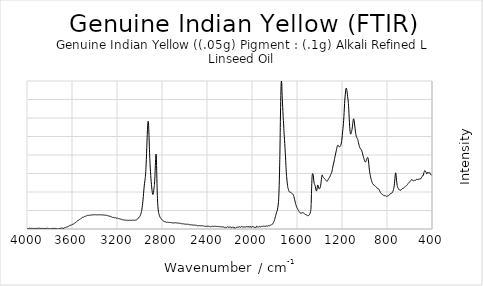
| Category | Series 0 |
|---|---|
| 3996.70739 | 0.005 |
| 3994.64617 | 0.006 |
| 3992.58495 | 0.008 |
| 3990.52373 | 0.007 |
| 3988.46251 | 0.006 |
| 3986.40129 | 0.007 |
| 3984.34007 | 0.009 |
| 3982.27885 | 0.01 |
| 3980.21763 | 0.01 |
| 3978.15641 | 0.01 |
| 3976.09519 | 0.01 |
| 3974.03396 | 0.008 |
| 3971.97274 | 0.006 |
| 3969.91152 | 0.006 |
| 3967.8503 | 0.009 |
| 3965.78908 | 0.01 |
| 3963.72786 | 0.009 |
| 3961.66664 | 0.008 |
| 3959.60542 | 0.009 |
| 3957.5442 | 0.008 |
| 3955.48298 | 0.006 |
| 3953.42175 | 0.006 |
| 3951.36053 | 0.008 |
| 3949.29931 | 0.008 |
| 3947.23809 | 0.008 |
| 3945.17687 | 0.009 |
| 3943.11565 | 0.009 |
| 3941.05443 | 0.008 |
| 3938.99321 | 0.007 |
| 3936.93199 | 0.007 |
| 3934.87077 | 0.005 |
| 3932.80955 | 0.005 |
| 3930.74832 | 0.006 |
| 3928.6871 | 0.008 |
| 3926.62588 | 0.009 |
| 3924.56466 | 0.009 |
| 3922.50344 | 0.008 |
| 3920.44222 | 0.007 |
| 3918.381 | 0.006 |
| 3916.31978 | 0.006 |
| 3914.25856 | 0.006 |
| 3912.19734 | 0.005 |
| 3910.13612 | 0.006 |
| 3908.07489 | 0.007 |
| 3906.01367 | 0.008 |
| 3903.95245 | 0.007 |
| 3901.89123 | 0.008 |
| 3899.83001 | 0.01 |
| 3897.76879 | 0.011 |
| 3895.70757 | 0.011 |
| 3893.64635 | 0.011 |
| 3891.58513 | 0.011 |
| 3889.52391 | 0.01 |
| 3887.46268 | 0.008 |
| 3885.40146 | 0.006 |
| 3883.34024 | 0.005 |
| 3881.27902 | 0.006 |
| 3879.2178 | 0.008 |
| 3877.15658 | 0.01 |
| 3875.09536 | 0.011 |
| 3873.03414 | 0.009 |
| 3870.97292 | 0.008 |
| 3868.9117 | 0.009 |
| 3866.85048 | 0.009 |
| 3864.78925 | 0.006 |
| 3862.72803 | 0.003 |
| 3860.66681 | 0.005 |
| 3858.60559 | 0.007 |
| 3856.54437 | 0.008 |
| 3854.48315 | 0.009 |
| 3852.42193 | 0.009 |
| 3850.36071 | 0.009 |
| 3848.29949 | 0.008 |
| 3846.23827 | 0.007 |
| 3844.17705 | 0.006 |
| 3842.11582 | 0.005 |
| 3840.0546 | 0.006 |
| 3837.99338 | 0.007 |
| 3835.93216 | 0.007 |
| 3833.87094 | 0.008 |
| 3831.80972 | 0.009 |
| 3829.7485 | 0.01 |
| 3827.68728 | 0.01 |
| 3825.62606 | 0.009 |
| 3823.56484 | 0.008 |
| 3821.50361 | 0.008 |
| 3819.44239 | 0.009 |
| 3817.38117 | 0.011 |
| 3815.31995 | 0.01 |
| 3813.25873 | 0.006 |
| 3811.19751 | 0.004 |
| 3809.13629 | 0.004 |
| 3807.07507 | 0.005 |
| 3805.01385 | 0.005 |
| 3802.95263 | 0.003 |
| 3800.89141 | 0.002 |
| 3798.83018 | 0.005 |
| 3796.76896 | 0.008 |
| 3794.70774 | 0.008 |
| 3792.64652 | 0.006 |
| 3790.5853 | 0.003 |
| 3788.52408 | 0.001 |
| 3786.46286 | 0.002 |
| 3784.40164 | 0.003 |
| 3782.34042 | 0.004 |
| 3780.2792 | 0.005 |
| 3778.21798 | 0.007 |
| 3776.15675 | 0.008 |
| 3774.09553 | 0.008 |
| 3772.03431 | 0.008 |
| 3769.97309 | 0.007 |
| 3767.91187 | 0.007 |
| 3765.85065 | 0.007 |
| 3763.78943 | 0.006 |
| 3761.72821 | 0.005 |
| 3759.66699 | 0.004 |
| 3757.60577 | 0.004 |
| 3755.54454 | 0.007 |
| 3753.48332 | 0.01 |
| 3751.4221 | 0.01 |
| 3749.36088 | 0.009 |
| 3747.29966 | 0.008 |
| 3745.23844 | 0.009 |
| 3743.17722 | 0.009 |
| 3741.116 | 0.007 |
| 3739.05478 | 0.005 |
| 3736.99356 | 0.003 |
| 3734.93234 | 0.003 |
| 3732.87111 | 0.002 |
| 3730.80989 | 0.001 |
| 3728.74867 | 0.002 |
| 3726.68745 | 0.002 |
| 3724.62623 | 0.001 |
| 3722.56501 | 0.001 |
| 3720.50379 | 0.001 |
| 3718.44257 | 0.002 |
| 3716.38135 | 0.002 |
| 3714.32013 | 0.004 |
| 3712.25891 | 0.005 |
| 3710.19768 | 0.005 |
| 3708.13646 | 0.007 |
| 3706.07524 | 0.01 |
| 3704.01402 | 0.011 |
| 3701.9528 | 0.01 |
| 3699.89158 | 0.008 |
| 3697.83036 | 0.007 |
| 3695.76914 | 0.009 |
| 3693.70792 | 0.012 |
| 3691.6467 | 0.015 |
| 3689.58548 | 0.015 |
| 3687.52425 | 0.011 |
| 3685.46303 | 0.01 |
| 3683.40181 | 0.011 |
| 3681.34059 | 0.013 |
| 3679.27937 | 0.014 |
| 3677.21815 | 0.012 |
| 3675.15693 | 0.009 |
| 3673.09571 | 0.008 |
| 3671.03449 | 0.01 |
| 3668.97327 | 0.015 |
| 3666.91204 | 0.018 |
| 3664.85082 | 0.019 |
| 3662.7896 | 0.019 |
| 3660.72838 | 0.02 |
| 3658.66716 | 0.02 |
| 3656.60594 | 0.022 |
| 3654.54472 | 0.026 |
| 3652.4835 | 0.028 |
| 3650.42228 | 0.026 |
| 3648.36106 | 0.025 |
| 3646.29984 | 0.028 |
| 3644.23861 | 0.03 |
| 3642.17739 | 0.031 |
| 3640.11617 | 0.031 |
| 3638.05495 | 0.031 |
| 3635.99373 | 0.033 |
| 3633.93251 | 0.036 |
| 3631.87129 | 0.037 |
| 3629.81007 | 0.036 |
| 3627.74885 | 0.037 |
| 3625.68763 | 0.039 |
| 3623.62641 | 0.043 |
| 3621.56518 | 0.047 |
| 3619.50396 | 0.05 |
| 3617.44274 | 0.05 |
| 3615.38152 | 0.05 |
| 3613.3203 | 0.05 |
| 3611.25908 | 0.05 |
| 3609.19786 | 0.049 |
| 3607.13664 | 0.05 |
| 3605.07542 | 0.053 |
| 3603.0142 | 0.055 |
| 3600.95297 | 0.059 |
| 3598.89175 | 0.062 |
| 3596.83053 | 0.064 |
| 3594.76931 | 0.063 |
| 3592.70809 | 0.062 |
| 3590.64687 | 0.064 |
| 3588.58565 | 0.065 |
| 3586.52443 | 0.066 |
| 3584.46321 | 0.07 |
| 3582.40199 | 0.073 |
| 3580.34077 | 0.075 |
| 3578.27954 | 0.077 |
| 3576.21832 | 0.079 |
| 3574.1571 | 0.081 |
| 3572.09588 | 0.084 |
| 3570.03466 | 0.088 |
| 3567.97344 | 0.088 |
| 3565.91222 | 0.09 |
| 3563.851 | 0.092 |
| 3561.78978 | 0.096 |
| 3559.72856 | 0.098 |
| 3557.66734 | 0.1 |
| 3555.60611 | 0.102 |
| 3553.54489 | 0.105 |
| 3551.48367 | 0.107 |
| 3549.42245 | 0.112 |
| 3547.36123 | 0.116 |
| 3545.30001 | 0.118 |
| 3543.23879 | 0.119 |
| 3541.17757 | 0.121 |
| 3539.11635 | 0.122 |
| 3537.05513 | 0.125 |
| 3534.9939 | 0.126 |
| 3532.93268 | 0.128 |
| 3530.87146 | 0.131 |
| 3528.81024 | 0.134 |
| 3526.74902 | 0.135 |
| 3524.6878 | 0.136 |
| 3522.62658 | 0.139 |
| 3520.56536 | 0.142 |
| 3518.50414 | 0.144 |
| 3516.44292 | 0.145 |
| 3514.3817 | 0.147 |
| 3512.32047 | 0.15 |
| 3510.25925 | 0.153 |
| 3508.19803 | 0.156 |
| 3506.13681 | 0.157 |
| 3504.07559 | 0.157 |
| 3502.01437 | 0.156 |
| 3499.95315 | 0.157 |
| 3497.89193 | 0.16 |
| 3495.83071 | 0.163 |
| 3493.76949 | 0.165 |
| 3491.70827 | 0.166 |
| 3489.64704 | 0.167 |
| 3487.58582 | 0.168 |
| 3485.5246 | 0.168 |
| 3483.46338 | 0.169 |
| 3481.40216 | 0.17 |
| 3479.34094 | 0.173 |
| 3477.27972 | 0.174 |
| 3475.2185 | 0.175 |
| 3473.15728 | 0.176 |
| 3471.09606 | 0.178 |
| 3469.03483 | 0.181 |
| 3466.97361 | 0.182 |
| 3464.91239 | 0.183 |
| 3462.85117 | 0.184 |
| 3460.78995 | 0.185 |
| 3458.72873 | 0.184 |
| 3456.66751 | 0.184 |
| 3454.60629 | 0.184 |
| 3452.54507 | 0.183 |
| 3450.48385 | 0.183 |
| 3448.42263 | 0.183 |
| 3446.3614 | 0.184 |
| 3444.30018 | 0.186 |
| 3442.23896 | 0.188 |
| 3440.17774 | 0.188 |
| 3438.11652 | 0.188 |
| 3436.0553 | 0.188 |
| 3433.99408 | 0.187 |
| 3431.93286 | 0.186 |
| 3429.87164 | 0.187 |
| 3427.81042 | 0.189 |
| 3425.7492 | 0.189 |
| 3423.68797 | 0.19 |
| 3421.62675 | 0.191 |
| 3419.56553 | 0.191 |
| 3417.50431 | 0.191 |
| 3415.44309 | 0.191 |
| 3413.38187 | 0.192 |
| 3411.32065 | 0.192 |
| 3409.25943 | 0.191 |
| 3407.19821 | 0.19 |
| 3405.13699 | 0.192 |
| 3403.07576 | 0.195 |
| 3401.01454 | 0.195 |
| 3398.95332 | 0.194 |
| 3396.8921 | 0.193 |
| 3394.83088 | 0.193 |
| 3392.76966 | 0.193 |
| 3390.70844 | 0.192 |
| 3388.64722 | 0.193 |
| 3386.586 | 0.194 |
| 3384.52478 | 0.192 |
| 3382.46356 | 0.191 |
| 3380.40233 | 0.192 |
| 3378.34111 | 0.192 |
| 3376.27989 | 0.192 |
| 3374.21867 | 0.192 |
| 3372.15745 | 0.191 |
| 3370.09623 | 0.192 |
| 3368.03501 | 0.192 |
| 3365.97379 | 0.191 |
| 3363.91257 | 0.192 |
| 3361.85135 | 0.193 |
| 3359.79013 | 0.191 |
| 3357.7289 | 0.191 |
| 3355.66768 | 0.193 |
| 3353.60646 | 0.193 |
| 3351.54524 | 0.192 |
| 3349.48402 | 0.191 |
| 3347.4228 | 0.192 |
| 3345.36158 | 0.191 |
| 3343.30036 | 0.19 |
| 3341.23914 | 0.189 |
| 3339.17792 | 0.19 |
| 3337.11669 | 0.192 |
| 3335.05547 | 0.191 |
| 3332.99425 | 0.19 |
| 3330.93303 | 0.19 |
| 3328.87181 | 0.19 |
| 3326.81059 | 0.19 |
| 3324.74937 | 0.19 |
| 3322.68815 | 0.191 |
| 3320.62693 | 0.191 |
| 3318.56571 | 0.189 |
| 3316.50449 | 0.188 |
| 3314.44326 | 0.189 |
| 3312.38204 | 0.189 |
| 3310.32082 | 0.187 |
| 3308.2596 | 0.186 |
| 3306.19838 | 0.185 |
| 3304.13716 | 0.185 |
| 3302.07594 | 0.184 |
| 3300.01472 | 0.185 |
| 3297.9535 | 0.185 |
| 3295.89228 | 0.186 |
| 3293.83106 | 0.186 |
| 3291.76983 | 0.185 |
| 3289.70861 | 0.183 |
| 3287.64739 | 0.182 |
| 3285.58617 | 0.182 |
| 3283.52495 | 0.18 |
| 3281.46373 | 0.178 |
| 3279.40251 | 0.177 |
| 3277.34129 | 0.177 |
| 3275.28007 | 0.176 |
| 3273.21885 | 0.177 |
| 3271.15763 | 0.178 |
| 3269.0964 | 0.177 |
| 3267.03518 | 0.173 |
| 3264.97396 | 0.171 |
| 3262.91274 | 0.171 |
| 3260.85152 | 0.17 |
| 3258.7903 | 0.169 |
| 3256.72908 | 0.17 |
| 3254.66786 | 0.17 |
| 3252.60664 | 0.168 |
| 3250.54542 | 0.166 |
| 3248.48419 | 0.164 |
| 3246.42297 | 0.162 |
| 3244.36175 | 0.16 |
| 3242.30053 | 0.157 |
| 3240.23931 | 0.156 |
| 3238.17809 | 0.157 |
| 3236.11687 | 0.159 |
| 3234.05565 | 0.16 |
| 3231.99443 | 0.158 |
| 3229.93321 | 0.157 |
| 3227.87199 | 0.158 |
| 3225.81076 | 0.157 |
| 3223.74954 | 0.154 |
| 3221.68832 | 0.153 |
| 3219.6271 | 0.154 |
| 3217.56588 | 0.154 |
| 3215.50466 | 0.154 |
| 3213.44344 | 0.152 |
| 3211.38222 | 0.15 |
| 3209.321 | 0.15 |
| 3207.25978 | 0.149 |
| 3205.19856 | 0.147 |
| 3203.13733 | 0.146 |
| 3201.07611 | 0.147 |
| 3199.01489 | 0.147 |
| 3196.95367 | 0.147 |
| 3194.89245 | 0.146 |
| 3192.83123 | 0.146 |
| 3190.77001 | 0.146 |
| 3188.70879 | 0.144 |
| 3186.64757 | 0.141 |
| 3184.58635 | 0.14 |
| 3182.52512 | 0.141 |
| 3180.4639 | 0.14 |
| 3178.40268 | 0.138 |
| 3176.34146 | 0.137 |
| 3174.28024 | 0.136 |
| 3172.21902 | 0.135 |
| 3170.1578 | 0.133 |
| 3168.09658 | 0.133 |
| 3166.03536 | 0.133 |
| 3163.97414 | 0.133 |
| 3161.91292 | 0.133 |
| 3159.85169 | 0.131 |
| 3157.79047 | 0.129 |
| 3155.72925 | 0.128 |
| 3153.66803 | 0.126 |
| 3151.60681 | 0.125 |
| 3149.54559 | 0.124 |
| 3147.48437 | 0.125 |
| 3145.42315 | 0.126 |
| 3143.36193 | 0.125 |
| 3141.30071 | 0.123 |
| 3139.23949 | 0.121 |
| 3137.17826 | 0.12 |
| 3135.11704 | 0.12 |
| 3133.05582 | 0.12 |
| 3130.9946 | 0.121 |
| 3128.93338 | 0.121 |
| 3126.87216 | 0.119 |
| 3124.81094 | 0.118 |
| 3122.74972 | 0.119 |
| 3120.6885 | 0.12 |
| 3118.62728 | 0.12 |
| 3116.56605 | 0.12 |
| 3114.50483 | 0.119 |
| 3112.44361 | 0.119 |
| 3110.38239 | 0.119 |
| 3108.32117 | 0.119 |
| 3106.25995 | 0.117 |
| 3104.19873 | 0.116 |
| 3102.13751 | 0.117 |
| 3100.07629 | 0.118 |
| 3098.01507 | 0.117 |
| 3095.95385 | 0.115 |
| 3093.89262 | 0.114 |
| 3091.8314 | 0.116 |
| 3089.77018 | 0.118 |
| 3087.70896 | 0.118 |
| 3085.64774 | 0.117 |
| 3083.58652 | 0.117 |
| 3081.5253 | 0.118 |
| 3079.46408 | 0.118 |
| 3077.40286 | 0.117 |
| 3075.34164 | 0.116 |
| 3073.28042 | 0.116 |
| 3071.21919 | 0.117 |
| 3069.15797 | 0.118 |
| 3067.09675 | 0.118 |
| 3065.03553 | 0.119 |
| 3062.97431 | 0.119 |
| 3060.91309 | 0.118 |
| 3058.85187 | 0.117 |
| 3056.79065 | 0.117 |
| 3054.72943 | 0.118 |
| 3052.66821 | 0.118 |
| 3050.60698 | 0.119 |
| 3048.54576 | 0.119 |
| 3046.48454 | 0.118 |
| 3044.42332 | 0.117 |
| 3042.3621 | 0.118 |
| 3040.30088 | 0.12 |
| 3038.23966 | 0.122 |
| 3036.17844 | 0.122 |
| 3034.11722 | 0.121 |
| 3032.056 | 0.121 |
| 3029.99478 | 0.122 |
| 3027.93355 | 0.123 |
| 3025.87233 | 0.126 |
| 3023.81111 | 0.128 |
| 3021.74989 | 0.13 |
| 3019.68867 | 0.133 |
| 3017.62745 | 0.135 |
| 3015.56623 | 0.137 |
| 3013.50501 | 0.14 |
| 3011.44379 | 0.142 |
| 3009.38257 | 0.147 |
| 3007.32135 | 0.152 |
| 3005.26012 | 0.158 |
| 3003.1989 | 0.161 |
| 3001.13768 | 0.163 |
| 2999.07646 | 0.167 |
| 2997.01524 | 0.171 |
| 2994.95402 | 0.176 |
| 2992.8928 | 0.182 |
| 2990.83158 | 0.189 |
| 2988.77036 | 0.198 |
| 2986.70914 | 0.21 |
| 2984.64791 | 0.223 |
| 2982.58669 | 0.235 |
| 2980.52547 | 0.251 |
| 2978.46425 | 0.269 |
| 2976.40303 | 0.291 |
| 2974.34181 | 0.315 |
| 2972.28059 | 0.34 |
| 2970.21937 | 0.37 |
| 2968.15815 | 0.404 |
| 2966.09693 | 0.44 |
| 2964.03571 | 0.476 |
| 2961.97448 | 0.513 |
| 2959.91326 | 0.548 |
| 2957.85204 | 0.582 |
| 2955.79082 | 0.611 |
| 2953.7296 | 0.635 |
| 2951.66838 | 0.657 |
| 2949.60716 | 0.681 |
| 2947.54594 | 0.711 |
| 2945.48472 | 0.752 |
| 2943.4235 | 0.804 |
| 2941.36228 | 0.867 |
| 2939.30105 | 0.938 |
| 2937.23983 | 1.017 |
| 2935.17861 | 1.103 |
| 2933.11739 | 1.19 |
| 2931.05617 | 1.273 |
| 2928.99495 | 1.345 |
| 2926.93373 | 1.404 |
| 2924.87251 | 1.444 |
| 2922.81129 | 1.457 |
| 2920.75007 | 1.439 |
| 2918.68885 | 1.388 |
| 2916.62762 | 1.31 |
| 2914.5664 | 1.216 |
| 2912.50518 | 1.119 |
| 2910.44396 | 1.03 |
| 2908.38274 | 0.951 |
| 2906.32152 | 0.883 |
| 2904.2603 | 0.824 |
| 2902.19908 | 0.771 |
| 2900.13786 | 0.723 |
| 2898.07664 | 0.68 |
| 2896.01541 | 0.641 |
| 2893.95419 | 0.604 |
| 2891.89297 | 0.57 |
| 2889.83175 | 0.538 |
| 2887.77053 | 0.511 |
| 2885.70931 | 0.49 |
| 2883.64809 | 0.474 |
| 2881.58687 | 0.467 |
| 2879.52565 | 0.468 |
| 2877.46443 | 0.477 |
| 2875.40321 | 0.495 |
| 2873.34198 | 0.521 |
| 2871.28076 | 0.547 |
| 2869.21954 | 0.572 |
| 2867.15832 | 0.602 |
| 2865.0971 | 0.645 |
| 2863.03588 | 0.705 |
| 2860.97466 | 0.778 |
| 2858.91344 | 0.86 |
| 2856.85222 | 0.938 |
| 2854.791 | 0.995 |
| 2852.72978 | 1.012 |
| 2850.66855 | 0.973 |
| 2848.60733 | 0.879 |
| 2846.54611 | 0.751 |
| 2844.48489 | 0.618 |
| 2842.42367 | 0.501 |
| 2840.36245 | 0.411 |
| 2838.30123 | 0.347 |
| 2836.24001 | 0.302 |
| 2834.17879 | 0.268 |
| 2832.11757 | 0.242 |
| 2830.05634 | 0.223 |
| 2827.99512 | 0.208 |
| 2825.9339 | 0.196 |
| 2823.87268 | 0.186 |
| 2821.81146 | 0.177 |
| 2819.75024 | 0.169 |
| 2817.68902 | 0.162 |
| 2815.6278 | 0.156 |
| 2813.56658 | 0.151 |
| 2811.50536 | 0.146 |
| 2809.44414 | 0.142 |
| 2807.38291 | 0.137 |
| 2805.32169 | 0.132 |
| 2803.26047 | 0.129 |
| 2801.19925 | 0.126 |
| 2799.13803 | 0.122 |
| 2797.07681 | 0.119 |
| 2795.01559 | 0.117 |
| 2792.95437 | 0.115 |
| 2790.89315 | 0.112 |
| 2788.83193 | 0.11 |
| 2786.77071 | 0.107 |
| 2784.70948 | 0.106 |
| 2782.64826 | 0.104 |
| 2780.58704 | 0.102 |
| 2778.52582 | 0.1 |
| 2776.4646 | 0.1 |
| 2774.40338 | 0.1 |
| 2772.34216 | 0.1 |
| 2770.28094 | 0.098 |
| 2768.21972 | 0.096 |
| 2766.1585 | 0.095 |
| 2764.09727 | 0.094 |
| 2762.03605 | 0.092 |
| 2759.97483 | 0.091 |
| 2757.91361 | 0.09 |
| 2755.85239 | 0.09 |
| 2753.79117 | 0.091 |
| 2751.72995 | 0.092 |
| 2749.66873 | 0.092 |
| 2747.60751 | 0.091 |
| 2745.54629 | 0.091 |
| 2743.48507 | 0.09 |
| 2741.42384 | 0.09 |
| 2739.36262 | 0.09 |
| 2737.3014 | 0.09 |
| 2735.24018 | 0.09 |
| 2733.17896 | 0.089 |
| 2731.11774 | 0.088 |
| 2729.05652 | 0.087 |
| 2726.9953 | 0.087 |
| 2724.93408 | 0.087 |
| 2722.87286 | 0.087 |
| 2720.81164 | 0.087 |
| 2718.75041 | 0.087 |
| 2716.68919 | 0.086 |
| 2714.62797 | 0.084 |
| 2712.56675 | 0.083 |
| 2710.50553 | 0.083 |
| 2708.44431 | 0.083 |
| 2706.38309 | 0.083 |
| 2704.32187 | 0.083 |
| 2702.26065 | 0.083 |
| 2700.19943 | 0.083 |
| 2698.1382 | 0.082 |
| 2696.07698 | 0.082 |
| 2694.01576 | 0.081 |
| 2691.95454 | 0.081 |
| 2689.89332 | 0.082 |
| 2687.8321 | 0.083 |
| 2685.77088 | 0.084 |
| 2683.70966 | 0.084 |
| 2681.64844 | 0.084 |
| 2679.58722 | 0.085 |
| 2677.526 | 0.085 |
| 2675.46477 | 0.084 |
| 2673.40355 | 0.083 |
| 2671.34233 | 0.082 |
| 2669.28111 | 0.082 |
| 2667.21989 | 0.082 |
| 2665.15867 | 0.081 |
| 2663.09745 | 0.081 |
| 2661.03623 | 0.08 |
| 2658.97501 | 0.08 |
| 2656.91379 | 0.081 |
| 2654.85257 | 0.08 |
| 2652.79134 | 0.08 |
| 2650.73012 | 0.079 |
| 2648.6689 | 0.078 |
| 2646.60768 | 0.079 |
| 2644.54646 | 0.079 |
| 2642.48524 | 0.078 |
| 2640.42402 | 0.077 |
| 2638.3628 | 0.076 |
| 2636.30158 | 0.075 |
| 2634.24036 | 0.075 |
| 2632.17913 | 0.074 |
| 2630.11791 | 0.073 |
| 2628.05669 | 0.073 |
| 2625.99547 | 0.073 |
| 2623.93425 | 0.073 |
| 2621.87303 | 0.072 |
| 2619.81181 | 0.07 |
| 2617.75059 | 0.069 |
| 2615.68937 | 0.07 |
| 2613.62815 | 0.071 |
| 2611.56693 | 0.072 |
| 2609.5057 | 0.071 |
| 2607.44448 | 0.069 |
| 2605.38326 | 0.068 |
| 2603.32204 | 0.067 |
| 2601.26082 | 0.067 |
| 2599.1996 | 0.067 |
| 2597.13838 | 0.066 |
| 2595.07716 | 0.066 |
| 2593.01594 | 0.066 |
| 2590.95472 | 0.065 |
| 2588.8935 | 0.065 |
| 2586.83227 | 0.064 |
| 2584.77105 | 0.065 |
| 2582.70983 | 0.065 |
| 2580.64861 | 0.064 |
| 2578.58739 | 0.063 |
| 2576.52617 | 0.064 |
| 2574.46495 | 0.064 |
| 2572.40373 | 0.063 |
| 2570.34251 | 0.064 |
| 2568.28129 | 0.065 |
| 2566.22007 | 0.064 |
| 2564.15884 | 0.063 |
| 2562.09762 | 0.061 |
| 2560.0364 | 0.06 |
| 2557.97518 | 0.059 |
| 2555.91396 | 0.058 |
| 2553.85274 | 0.057 |
| 2551.79152 | 0.057 |
| 2549.7303 | 0.058 |
| 2547.66908 | 0.058 |
| 2545.60786 | 0.056 |
| 2543.54663 | 0.055 |
| 2541.48541 | 0.057 |
| 2539.42419 | 0.058 |
| 2537.36297 | 0.056 |
| 2535.30175 | 0.055 |
| 2533.24053 | 0.055 |
| 2531.17931 | 0.054 |
| 2529.11809 | 0.054 |
| 2527.05687 | 0.054 |
| 2524.99565 | 0.053 |
| 2522.93443 | 0.052 |
| 2520.8732 | 0.052 |
| 2518.81198 | 0.053 |
| 2516.75076 | 0.054 |
| 2514.68954 | 0.054 |
| 2512.62832 | 0.054 |
| 2510.5671 | 0.053 |
| 2508.50588 | 0.052 |
| 2506.44466 | 0.052 |
| 2504.38344 | 0.051 |
| 2502.32222 | 0.05 |
| 2500.261 | 0.05 |
| 2498.19977 | 0.048 |
| 2496.13855 | 0.047 |
| 2494.07733 | 0.049 |
| 2492.01611 | 0.05 |
| 2489.95489 | 0.048 |
| 2487.89367 | 0.045 |
| 2485.83245 | 0.044 |
| 2483.77123 | 0.043 |
| 2481.71001 | 0.045 |
| 2479.64879 | 0.046 |
| 2477.58756 | 0.045 |
| 2475.52634 | 0.045 |
| 2473.46512 | 0.045 |
| 2471.4039 | 0.046 |
| 2469.34268 | 0.046 |
| 2467.28146 | 0.046 |
| 2465.22024 | 0.045 |
| 2463.15902 | 0.044 |
| 2461.0978 | 0.044 |
| 2459.03658 | 0.044 |
| 2456.97536 | 0.044 |
| 2454.91413 | 0.044 |
| 2452.85291 | 0.045 |
| 2450.79169 | 0.044 |
| 2448.73047 | 0.043 |
| 2446.66925 | 0.042 |
| 2444.60803 | 0.043 |
| 2442.54681 | 0.043 |
| 2440.48559 | 0.044 |
| 2438.42437 | 0.045 |
| 2436.36315 | 0.046 |
| 2434.30193 | 0.043 |
| 2432.2407 | 0.04 |
| 2430.17948 | 0.039 |
| 2428.11826 | 0.04 |
| 2426.05704 | 0.039 |
| 2423.99582 | 0.038 |
| 2421.9346 | 0.037 |
| 2419.87338 | 0.038 |
| 2417.81216 | 0.039 |
| 2415.75094 | 0.038 |
| 2413.68972 | 0.037 |
| 2411.62849 | 0.036 |
| 2409.56727 | 0.036 |
| 2407.50605 | 0.038 |
| 2405.44483 | 0.037 |
| 2403.38361 | 0.036 |
| 2401.32239 | 0.036 |
| 2399.26117 | 0.038 |
| 2397.19995 | 0.038 |
| 2395.13873 | 0.037 |
| 2393.07751 | 0.036 |
| 2391.01629 | 0.036 |
| 2388.95506 | 0.036 |
| 2386.89384 | 0.037 |
| 2384.83262 | 0.036 |
| 2382.7714 | 0.035 |
| 2380.71018 | 0.036 |
| 2378.64896 | 0.036 |
| 2376.58774 | 0.035 |
| 2374.52652 | 0.035 |
| 2372.4653 | 0.034 |
| 2370.40408 | 0.032 |
| 2368.34286 | 0.031 |
| 2366.28163 | 0.03 |
| 2364.22041 | 0.029 |
| 2362.15919 | 0.03 |
| 2360.09797 | 0.033 |
| 2358.03675 | 0.036 |
| 2355.97553 | 0.039 |
| 2353.91431 | 0.039 |
| 2351.85309 | 0.037 |
| 2349.79187 | 0.038 |
| 2347.73065 | 0.038 |
| 2345.66942 | 0.037 |
| 2343.6082 | 0.035 |
| 2341.54698 | 0.033 |
| 2339.48576 | 0.033 |
| 2337.42454 | 0.034 |
| 2335.36332 | 0.036 |
| 2333.3021 | 0.036 |
| 2331.24088 | 0.035 |
| 2329.17966 | 0.035 |
| 2327.11844 | 0.037 |
| 2325.05722 | 0.038 |
| 2322.99599 | 0.037 |
| 2320.93477 | 0.035 |
| 2318.87355 | 0.036 |
| 2316.81233 | 0.036 |
| 2314.75111 | 0.034 |
| 2312.68989 | 0.032 |
| 2310.62867 | 0.032 |
| 2308.56745 | 0.033 |
| 2306.50623 | 0.034 |
| 2304.44501 | 0.035 |
| 2302.38379 | 0.035 |
| 2300.32256 | 0.036 |
| 2298.26134 | 0.035 |
| 2296.20012 | 0.033 |
| 2294.1389 | 0.033 |
| 2292.07768 | 0.033 |
| 2290.01646 | 0.031 |
| 2287.95524 | 0.031 |
| 2285.89402 | 0.032 |
| 2283.8328 | 0.033 |
| 2281.77158 | 0.032 |
| 2279.71035 | 0.032 |
| 2277.64913 | 0.032 |
| 2275.58791 | 0.03 |
| 2273.52669 | 0.031 |
| 2271.46547 | 0.03 |
| 2269.40425 | 0.028 |
| 2267.34303 | 0.028 |
| 2265.28181 | 0.029 |
| 2263.22059 | 0.028 |
| 2261.15937 | 0.027 |
| 2259.09815 | 0.029 |
| 2257.03692 | 0.03 |
| 2254.9757 | 0.029 |
| 2252.91448 | 0.028 |
| 2250.85326 | 0.026 |
| 2248.79204 | 0.024 |
| 2246.73082 | 0.022 |
| 2244.6696 | 0.02 |
| 2242.60838 | 0.022 |
| 2240.54716 | 0.023 |
| 2238.48594 | 0.021 |
| 2236.42472 | 0.019 |
| 2234.36349 | 0.022 |
| 2232.30227 | 0.023 |
| 2230.24105 | 0.02 |
| 2228.17983 | 0.019 |
| 2226.11861 | 0.022 |
| 2224.05739 | 0.025 |
| 2221.99617 | 0.027 |
| 2219.93495 | 0.028 |
| 2217.87373 | 0.029 |
| 2215.81251 | 0.029 |
| 2213.75129 | 0.026 |
| 2211.69006 | 0.023 |
| 2209.62884 | 0.023 |
| 2207.56762 | 0.025 |
| 2205.5064 | 0.026 |
| 2203.44518 | 0.024 |
| 2201.38396 | 0.024 |
| 2199.32274 | 0.026 |
| 2197.26152 | 0.026 |
| 2195.2003 | 0.026 |
| 2193.13908 | 0.028 |
| 2191.07785 | 0.029 |
| 2189.01663 | 0.025 |
| 2186.95541 | 0.018 |
| 2184.89419 | 0.016 |
| 2182.83297 | 0.019 |
| 2180.77175 | 0.021 |
| 2178.71053 | 0.02 |
| 2176.64931 | 0.022 |
| 2174.58809 | 0.025 |
| 2172.52687 | 0.025 |
| 2170.46565 | 0.024 |
| 2168.40442 | 0.025 |
| 2166.3432 | 0.026 |
| 2164.28198 | 0.023 |
| 2162.22076 | 0.016 |
| 2160.15954 | 0.012 |
| 2158.09832 | 0.015 |
| 2156.0371 | 0.02 |
| 2153.97588 | 0.02 |
| 2151.91466 | 0.017 |
| 2149.85344 | 0.013 |
| 2147.79222 | 0.01 |
| 2145.73099 | 0.014 |
| 2143.66977 | 0.018 |
| 2141.60855 | 0.018 |
| 2139.54733 | 0.02 |
| 2137.48611 | 0.023 |
| 2135.42489 | 0.022 |
| 2133.36367 | 0.024 |
| 2131.30245 | 0.027 |
| 2129.24123 | 0.026 |
| 2127.18001 | 0.023 |
| 2125.11878 | 0.022 |
| 2123.05756 | 0.025 |
| 2120.99634 | 0.025 |
| 2118.93512 | 0.024 |
| 2116.8739 | 0.026 |
| 2114.81268 | 0.028 |
| 2112.75146 | 0.029 |
| 2110.69024 | 0.03 |
| 2108.62902 | 0.03 |
| 2106.5678 | 0.026 |
| 2104.50658 | 0.022 |
| 2102.44535 | 0.023 |
| 2100.38413 | 0.025 |
| 2098.32291 | 0.026 |
| 2096.26169 | 0.028 |
| 2094.20047 | 0.032 |
| 2092.13925 | 0.037 |
| 2090.07803 | 0.036 |
| 2088.01681 | 0.031 |
| 2085.95559 | 0.027 |
| 2083.89437 | 0.026 |
| 2081.83315 | 0.028 |
| 2079.77192 | 0.03 |
| 2077.7107 | 0.03 |
| 2075.64948 | 0.027 |
| 2073.58826 | 0.027 |
| 2071.52704 | 0.029 |
| 2069.46582 | 0.03 |
| 2067.4046 | 0.028 |
| 2065.34338 | 0.027 |
| 2063.28216 | 0.028 |
| 2061.22094 | 0.03 |
| 2059.15971 | 0.029 |
| 2057.09849 | 0.026 |
| 2055.03727 | 0.025 |
| 2052.97605 | 0.028 |
| 2050.91483 | 0.032 |
| 2048.85361 | 0.032 |
| 2046.79239 | 0.029 |
| 2044.73117 | 0.029 |
| 2042.66995 | 0.03 |
| 2040.60873 | 0.031 |
| 2038.54751 | 0.03 |
| 2036.48628 | 0.026 |
| 2034.42506 | 0.026 |
| 2032.36384 | 0.031 |
| 2030.30262 | 0.035 |
| 2028.2414 | 0.031 |
| 2026.18018 | 0.025 |
| 2024.11896 | 0.025 |
| 2022.05774 | 0.028 |
| 2019.99652 | 0.028 |
| 2017.9353 | 0.03 |
| 2015.87408 | 0.034 |
| 2013.81285 | 0.035 |
| 2011.75163 | 0.031 |
| 2009.69041 | 0.024 |
| 2007.62919 | 0.02 |
| 2005.56797 | 0.021 |
| 2003.50675 | 0.025 |
| 2001.44553 | 0.03 |
| 1999.38431 | 0.034 |
| 1997.32309 | 0.033 |
| 1995.26187 | 0.031 |
| 1993.20064 | 0.029 |
| 1991.13942 | 0.026 |
| 1989.0782 | 0.027 |
| 1987.01698 | 0.031 |
| 1984.95576 | 0.028 |
| 1982.89454 | 0.024 |
| 1980.83332 | 0.025 |
| 1978.7721 | 0.023 |
| 1976.71088 | 0.02 |
| 1974.64966 | 0.02 |
| 1972.58844 | 0.02 |
| 1970.52721 | 0.02 |
| 1968.46599 | 0.018 |
| 1966.40477 | 0.017 |
| 1964.34355 | 0.02 |
| 1962.28233 | 0.028 |
| 1960.22111 | 0.036 |
| 1958.15989 | 0.04 |
| 1956.09867 | 0.037 |
| 1954.03745 | 0.033 |
| 1951.97623 | 0.029 |
| 1949.91501 | 0.025 |
| 1947.85378 | 0.025 |
| 1945.79256 | 0.027 |
| 1943.73134 | 0.028 |
| 1941.67012 | 0.027 |
| 1939.6089 | 0.028 |
| 1937.54768 | 0.032 |
| 1935.48646 | 0.034 |
| 1933.42524 | 0.032 |
| 1931.36402 | 0.031 |
| 1929.3028 | 0.032 |
| 1927.24157 | 0.032 |
| 1925.18035 | 0.03 |
| 1923.11913 | 0.029 |
| 1921.05791 | 0.031 |
| 1918.99669 | 0.033 |
| 1916.93547 | 0.034 |
| 1914.87425 | 0.035 |
| 1912.81303 | 0.036 |
| 1910.75181 | 0.037 |
| 1908.69059 | 0.036 |
| 1906.62937 | 0.035 |
| 1904.56814 | 0.035 |
| 1902.50692 | 0.036 |
| 1900.4457 | 0.036 |
| 1898.38448 | 0.038 |
| 1896.32326 | 0.039 |
| 1894.26204 | 0.04 |
| 1892.20082 | 0.039 |
| 1890.1396 | 0.038 |
| 1888.07838 | 0.038 |
| 1886.01716 | 0.038 |
| 1883.95594 | 0.038 |
| 1881.89471 | 0.037 |
| 1879.83349 | 0.036 |
| 1877.77227 | 0.037 |
| 1875.71105 | 0.038 |
| 1873.64983 | 0.039 |
| 1871.58861 | 0.041 |
| 1869.52739 | 0.042 |
| 1867.46617 | 0.04 |
| 1865.40495 | 0.039 |
| 1863.34373 | 0.039 |
| 1861.2825 | 0.04 |
| 1859.22128 | 0.041 |
| 1857.16006 | 0.041 |
| 1855.09884 | 0.043 |
| 1853.03762 | 0.044 |
| 1850.9764 | 0.043 |
| 1848.91518 | 0.043 |
| 1846.85396 | 0.043 |
| 1844.79274 | 0.044 |
| 1842.73152 | 0.046 |
| 1840.6703 | 0.049 |
| 1838.60907 | 0.051 |
| 1836.54785 | 0.052 |
| 1834.48663 | 0.051 |
| 1832.42541 | 0.051 |
| 1830.36419 | 0.051 |
| 1828.30297 | 0.054 |
| 1826.24175 | 0.057 |
| 1824.18053 | 0.06 |
| 1822.11931 | 0.063 |
| 1820.05809 | 0.064 |
| 1817.99687 | 0.066 |
| 1815.93564 | 0.07 |
| 1813.87442 | 0.075 |
| 1811.8132 | 0.08 |
| 1809.75198 | 0.086 |
| 1807.69076 | 0.092 |
| 1805.62954 | 0.098 |
| 1803.56832 | 0.104 |
| 1801.5071 | 0.114 |
| 1799.44588 | 0.126 |
| 1797.38466 | 0.137 |
| 1795.32344 | 0.146 |
| 1793.26221 | 0.158 |
| 1791.20099 | 0.172 |
| 1789.13977 | 0.184 |
| 1787.07855 | 0.194 |
| 1785.01733 | 0.205 |
| 1782.95611 | 0.216 |
| 1780.89489 | 0.227 |
| 1778.83367 | 0.237 |
| 1776.77245 | 0.247 |
| 1774.71123 | 0.256 |
| 1772.65 | 0.27 |
| 1770.58878 | 0.289 |
| 1768.52756 | 0.311 |
| 1766.46634 | 0.339 |
| 1764.40512 | 0.372 |
| 1762.3439 | 0.423 |
| 1760.28268 | 0.498 |
| 1758.22146 | 0.59 |
| 1756.16024 | 0.716 |
| 1754.09902 | 0.853 |
| 1752.0378 | 1.009 |
| 1749.97657 | 1.224 |
| 1747.91535 | 1.452 |
| 1745.85413 | 1.643 |
| 1743.79291 | 1.805 |
| 1741.73169 | 1.928 |
| 1739.67047 | 1.993 |
| 1737.60925 | 2 |
| 1735.54803 | 1.963 |
| 1733.48681 | 1.875 |
| 1731.42559 | 1.784 |
| 1729.36437 | 1.715 |
| 1727.30314 | 1.651 |
| 1725.24192 | 1.587 |
| 1723.1807 | 1.522 |
| 1721.11948 | 1.468 |
| 1719.05826 | 1.42 |
| 1716.99704 | 1.36 |
| 1714.93582 | 1.299 |
| 1712.8746 | 1.252 |
| 1710.81338 | 1.206 |
| 1708.75216 | 1.157 |
| 1706.69093 | 1.1 |
| 1704.62971 | 1.039 |
| 1702.56849 | 0.989 |
| 1700.50727 | 0.929 |
| 1698.44605 | 0.858 |
| 1696.38483 | 0.801 |
| 1694.32361 | 0.747 |
| 1692.26239 | 0.709 |
| 1690.20117 | 0.675 |
| 1688.13995 | 0.643 |
| 1686.07873 | 0.618 |
| 1684.0175 | 0.589 |
| 1681.95628 | 0.564 |
| 1679.89506 | 0.553 |
| 1677.83384 | 0.544 |
| 1675.77262 | 0.534 |
| 1673.7114 | 0.523 |
| 1671.65018 | 0.515 |
| 1669.58896 | 0.509 |
| 1667.52774 | 0.502 |
| 1665.46652 | 0.498 |
| 1663.4053 | 0.496 |
| 1661.34407 | 0.495 |
| 1659.28285 | 0.495 |
| 1657.22163 | 0.495 |
| 1655.16041 | 0.494 |
| 1653.09919 | 0.491 |
| 1651.03797 | 0.489 |
| 1648.97675 | 0.488 |
| 1646.91553 | 0.485 |
| 1644.85431 | 0.482 |
| 1642.79309 | 0.479 |
| 1640.73186 | 0.476 |
| 1638.67064 | 0.474 |
| 1636.60942 | 0.471 |
| 1634.5482 | 0.464 |
| 1632.48698 | 0.457 |
| 1630.42576 | 0.45 |
| 1628.36454 | 0.441 |
| 1626.30332 | 0.431 |
| 1624.2421 | 0.418 |
| 1622.18088 | 0.402 |
| 1620.11966 | 0.39 |
| 1618.05843 | 0.378 |
| 1615.99721 | 0.362 |
| 1613.93599 | 0.35 |
| 1611.87477 | 0.34 |
| 1609.81355 | 0.329 |
| 1607.75233 | 0.319 |
| 1605.69111 | 0.309 |
| 1603.62989 | 0.3 |
| 1601.56867 | 0.291 |
| 1599.50745 | 0.285 |
| 1597.44623 | 0.279 |
| 1595.385 | 0.274 |
| 1593.32378 | 0.267 |
| 1591.26256 | 0.261 |
| 1589.20134 | 0.255 |
| 1587.14012 | 0.25 |
| 1585.0789 | 0.245 |
| 1583.01768 | 0.24 |
| 1580.95646 | 0.236 |
| 1578.89524 | 0.232 |
| 1576.83402 | 0.228 |
| 1574.77279 | 0.223 |
| 1572.71157 | 0.22 |
| 1570.65035 | 0.218 |
| 1568.58913 | 0.215 |
| 1566.52791 | 0.212 |
| 1564.46669 | 0.212 |
| 1562.40547 | 0.213 |
| 1560.34425 | 0.215 |
| 1558.28303 | 0.216 |
| 1556.22181 | 0.217 |
| 1554.16059 | 0.219 |
| 1552.09936 | 0.221 |
| 1550.03814 | 0.221 |
| 1547.97692 | 0.22 |
| 1545.9157 | 0.221 |
| 1543.85448 | 0.221 |
| 1541.79326 | 0.218 |
| 1539.73204 | 0.213 |
| 1537.67082 | 0.21 |
| 1535.6096 | 0.208 |
| 1533.54838 | 0.206 |
| 1531.48716 | 0.203 |
| 1529.42593 | 0.2 |
| 1527.36471 | 0.197 |
| 1525.30349 | 0.196 |
| 1523.24227 | 0.195 |
| 1521.18105 | 0.194 |
| 1519.11983 | 0.194 |
| 1517.05861 | 0.192 |
| 1514.99739 | 0.19 |
| 1512.93617 | 0.188 |
| 1510.87495 | 0.187 |
| 1508.81372 | 0.185 |
| 1506.7525 | 0.18 |
| 1504.69128 | 0.178 |
| 1502.63006 | 0.179 |
| 1500.56884 | 0.18 |
| 1498.50762 | 0.182 |
| 1496.4464 | 0.183 |
| 1494.38518 | 0.185 |
| 1492.32396 | 0.187 |
| 1490.26274 | 0.191 |
| 1488.20152 | 0.198 |
| 1486.14029 | 0.203 |
| 1484.07907 | 0.209 |
| 1482.01785 | 0.218 |
| 1479.95663 | 0.23 |
| 1477.89541 | 0.249 |
| 1475.83419 | 0.28 |
| 1473.77297 | 0.345 |
| 1471.71175 | 0.462 |
| 1469.65053 | 0.572 |
| 1467.58931 | 0.652 |
| 1465.52809 | 0.712 |
| 1463.46686 | 0.741 |
| 1461.40564 | 0.748 |
| 1459.34442 | 0.748 |
| 1457.2832 | 0.74 |
| 1455.22198 | 0.718 |
| 1453.16076 | 0.689 |
| 1451.09954 | 0.66 |
| 1449.03832 | 0.635 |
| 1446.9771 | 0.617 |
| 1444.91588 | 0.607 |
| 1442.85466 | 0.6 |
| 1440.79343 | 0.595 |
| 1438.73221 | 0.587 |
| 1436.67099 | 0.572 |
| 1434.60977 | 0.554 |
| 1432.54855 | 0.54 |
| 1430.48733 | 0.526 |
| 1428.42611 | 0.515 |
| 1426.36489 | 0.513 |
| 1424.30367 | 0.521 |
| 1422.24245 | 0.537 |
| 1420.18122 | 0.558 |
| 1418.12 | 0.582 |
| 1416.05878 | 0.595 |
| 1413.99756 | 0.593 |
| 1411.93634 | 0.582 |
| 1409.87512 | 0.566 |
| 1407.8139 | 0.554 |
| 1405.75268 | 0.547 |
| 1403.69146 | 0.545 |
| 1401.63024 | 0.544 |
| 1399.56902 | 0.545 |
| 1397.50779 | 0.548 |
| 1395.44657 | 0.554 |
| 1393.38535 | 0.564 |
| 1391.32413 | 0.576 |
| 1389.26291 | 0.593 |
| 1387.20169 | 0.615 |
| 1385.14047 | 0.641 |
| 1383.07925 | 0.669 |
| 1381.01803 | 0.698 |
| 1378.95681 | 0.721 |
| 1376.89559 | 0.731 |
| 1374.83436 | 0.727 |
| 1372.77314 | 0.718 |
| 1370.71192 | 0.709 |
| 1368.6507 | 0.704 |
| 1366.58948 | 0.699 |
| 1364.52826 | 0.695 |
| 1362.46704 | 0.691 |
| 1360.40582 | 0.688 |
| 1358.3446 | 0.687 |
| 1356.28338 | 0.684 |
| 1354.22215 | 0.68 |
| 1352.16093 | 0.676 |
| 1350.09971 | 0.672 |
| 1348.03849 | 0.668 |
| 1345.97727 | 0.663 |
| 1343.91605 | 0.659 |
| 1341.85483 | 0.656 |
| 1339.79361 | 0.653 |
| 1337.73239 | 0.649 |
| 1335.67117 | 0.646 |
| 1333.60995 | 0.644 |
| 1331.54872 | 0.645 |
| 1329.4875 | 0.649 |
| 1327.42628 | 0.655 |
| 1325.36506 | 0.662 |
| 1323.30384 | 0.668 |
| 1321.24262 | 0.675 |
| 1319.1814 | 0.681 |
| 1317.12018 | 0.686 |
| 1315.05896 | 0.69 |
| 1312.99774 | 0.694 |
| 1310.93652 | 0.699 |
| 1308.87529 | 0.705 |
| 1306.81407 | 0.712 |
| 1304.75285 | 0.72 |
| 1302.69163 | 0.728 |
| 1300.63041 | 0.735 |
| 1298.56919 | 0.742 |
| 1296.50797 | 0.748 |
| 1294.44675 | 0.755 |
| 1292.38553 | 0.762 |
| 1290.32431 | 0.771 |
| 1288.26308 | 0.785 |
| 1286.20186 | 0.802 |
| 1284.14064 | 0.819 |
| 1282.07942 | 0.836 |
| 1280.0182 | 0.852 |
| 1277.95698 | 0.866 |
| 1275.89576 | 0.879 |
| 1273.83454 | 0.892 |
| 1271.77332 | 0.905 |
| 1269.7121 | 0.92 |
| 1267.65088 | 0.936 |
| 1265.58965 | 0.953 |
| 1263.52843 | 0.97 |
| 1261.46721 | 0.985 |
| 1259.40599 | 0.999 |
| 1257.34477 | 1.013 |
| 1255.28355 | 1.027 |
| 1253.22233 | 1.041 |
| 1251.16111 | 1.056 |
| 1249.09989 | 1.072 |
| 1247.03867 | 1.087 |
| 1244.97745 | 1.102 |
| 1242.91622 | 1.114 |
| 1240.855 | 1.123 |
| 1238.79378 | 1.129 |
| 1236.73256 | 1.132 |
| 1234.67134 | 1.132 |
| 1232.61012 | 1.13 |
| 1230.5489 | 1.124 |
| 1228.48768 | 1.118 |
| 1226.42646 | 1.113 |
| 1224.36524 | 1.11 |
| 1222.30401 | 1.109 |
| 1220.24279 | 1.11 |
| 1218.18157 | 1.113 |
| 1216.12035 | 1.118 |
| 1214.05913 | 1.124 |
| 1211.99791 | 1.128 |
| 1209.93669 | 1.136 |
| 1207.87547 | 1.147 |
| 1205.81425 | 1.162 |
| 1203.75303 | 1.179 |
| 1201.69181 | 1.201 |
| 1199.63058 | 1.229 |
| 1197.56936 | 1.264 |
| 1195.50814 | 1.298 |
| 1193.44692 | 1.329 |
| 1191.3857 | 1.359 |
| 1189.32448 | 1.391 |
| 1187.26326 | 1.427 |
| 1185.20204 | 1.47 |
| 1183.14082 | 1.519 |
| 1181.0796 | 1.574 |
| 1179.01838 | 1.635 |
| 1176.95715 | 1.693 |
| 1174.89593 | 1.744 |
| 1172.83471 | 1.785 |
| 1170.77349 | 1.821 |
| 1168.71227 | 1.851 |
| 1166.65105 | 1.876 |
| 1164.58983 | 1.895 |
| 1162.52861 | 1.904 |
| 1160.46739 | 1.901 |
| 1158.40617 | 1.889 |
| 1156.34494 | 1.869 |
| 1154.28372 | 1.844 |
| 1152.2225 | 1.818 |
| 1150.16128 | 1.793 |
| 1148.10006 | 1.77 |
| 1146.03884 | 1.745 |
| 1143.97762 | 1.712 |
| 1141.9164 | 1.671 |
| 1139.85518 | 1.619 |
| 1137.79396 | 1.558 |
| 1135.73274 | 1.496 |
| 1133.67151 | 1.437 |
| 1131.61029 | 1.383 |
| 1129.54907 | 1.339 |
| 1127.48785 | 1.308 |
| 1125.42663 | 1.29 |
| 1123.36541 | 1.282 |
| 1121.30419 | 1.283 |
| 1119.24297 | 1.291 |
| 1117.18175 | 1.303 |
| 1115.12053 | 1.316 |
| 1113.05931 | 1.33 |
| 1110.99808 | 1.346 |
| 1108.93686 | 1.365 |
| 1106.87564 | 1.389 |
| 1104.81442 | 1.416 |
| 1102.7532 | 1.443 |
| 1100.69198 | 1.468 |
| 1098.63076 | 1.485 |
| 1096.56954 | 1.49 |
| 1094.50832 | 1.483 |
| 1092.4471 | 1.467 |
| 1090.38588 | 1.445 |
| 1088.32465 | 1.419 |
| 1086.26343 | 1.391 |
| 1084.20221 | 1.364 |
| 1082.14099 | 1.337 |
| 1080.07977 | 1.313 |
| 1078.01855 | 1.291 |
| 1075.95733 | 1.273 |
| 1073.89611 | 1.258 |
| 1071.83489 | 1.246 |
| 1069.77367 | 1.238 |
| 1067.71244 | 1.232 |
| 1065.65122 | 1.227 |
| 1063.59 | 1.222 |
| 1061.52878 | 1.216 |
| 1059.46756 | 1.207 |
| 1057.40634 | 1.195 |
| 1055.34512 | 1.18 |
| 1053.2839 | 1.165 |
| 1051.22268 | 1.15 |
| 1049.16146 | 1.137 |
| 1047.10024 | 1.127 |
| 1045.03901 | 1.116 |
| 1042.97779 | 1.105 |
| 1040.91657 | 1.096 |
| 1038.85535 | 1.089 |
| 1036.79413 | 1.087 |
| 1034.73291 | 1.086 |
| 1032.67169 | 1.085 |
| 1030.61047 | 1.081 |
| 1028.54925 | 1.075 |
| 1026.48803 | 1.066 |
| 1024.42681 | 1.057 |
| 1022.36558 | 1.048 |
| 1020.30436 | 1.037 |
| 1018.24314 | 1.026 |
| 1016.18192 | 1.013 |
| 1014.1207 | 1 |
| 1012.05948 | 0.987 |
| 1009.99826 | 0.977 |
| 1007.93704 | 0.966 |
| 1005.87582 | 0.954 |
| 1003.8146 | 0.944 |
| 1001.75337 | 0.934 |
| 999.69215 | 0.925 |
| 997.63093 | 0.916 |
| 995.56971 | 0.91 |
| 993.50849 | 0.905 |
| 991.44727 | 0.905 |
| 989.38605 | 0.908 |
| 987.32483 | 0.914 |
| 985.26361 | 0.921 |
| 983.20239 | 0.93 |
| 981.14117 | 0.94 |
| 979.07994 | 0.95 |
| 977.01872 | 0.957 |
| 974.9575 | 0.962 |
| 972.89628 | 0.966 |
| 970.83506 | 0.966 |
| 968.77384 | 0.959 |
| 966.71262 | 0.944 |
| 964.6514 | 0.919 |
| 962.59018 | 0.888 |
| 960.52896 | 0.856 |
| 958.46774 | 0.826 |
| 956.40651 | 0.8 |
| 954.34529 | 0.776 |
| 952.28407 | 0.755 |
| 950.22285 | 0.737 |
| 948.16163 | 0.722 |
| 946.10041 | 0.706 |
| 944.03919 | 0.691 |
| 941.97797 | 0.679 |
| 939.91675 | 0.667 |
| 937.85553 | 0.655 |
| 935.7943 | 0.645 |
| 933.73308 | 0.635 |
| 931.67186 | 0.628 |
| 929.61064 | 0.62 |
| 927.54942 | 0.614 |
| 925.4882 | 0.609 |
| 923.42698 | 0.606 |
| 921.36576 | 0.601 |
| 919.30454 | 0.595 |
| 917.24332 | 0.592 |
| 915.1821 | 0.59 |
| 913.12087 | 0.588 |
| 911.05965 | 0.586 |
| 908.99843 | 0.584 |
| 906.93721 | 0.581 |
| 904.87599 | 0.578 |
| 902.81477 | 0.576 |
| 900.75355 | 0.574 |
| 898.69233 | 0.571 |
| 896.63111 | 0.568 |
| 894.56989 | 0.566 |
| 892.50867 | 0.565 |
| 890.44744 | 0.561 |
| 888.38622 | 0.555 |
| 886.325 | 0.549 |
| 884.26378 | 0.544 |
| 882.20256 | 0.543 |
| 880.14134 | 0.544 |
| 878.08012 | 0.544 |
| 876.0189 | 0.543 |
| 873.95768 | 0.54 |
| 871.89646 | 0.536 |
| 869.83523 | 0.532 |
| 867.77401 | 0.526 |
| 865.71279 | 0.519 |
| 863.65157 | 0.51 |
| 861.59035 | 0.502 |
| 859.52913 | 0.496 |
| 857.46791 | 0.491 |
| 855.40669 | 0.488 |
| 853.34547 | 0.484 |
| 851.28425 | 0.48 |
| 849.22303 | 0.477 |
| 847.1618 | 0.475 |
| 845.10058 | 0.473 |
| 843.03936 | 0.472 |
| 840.97814 | 0.467 |
| 838.91692 | 0.462 |
| 836.8557 | 0.46 |
| 834.79448 | 0.46 |
| 832.73326 | 0.459 |
| 830.67204 | 0.457 |
| 828.61082 | 0.452 |
| 826.5496 | 0.449 |
| 824.48837 | 0.449 |
| 822.42715 | 0.45 |
| 820.36593 | 0.45 |
| 818.30471 | 0.45 |
| 816.24349 | 0.451 |
| 814.18227 | 0.45 |
| 812.12105 | 0.446 |
| 810.05983 | 0.444 |
| 807.99861 | 0.442 |
| 805.93739 | 0.439 |
| 803.87616 | 0.437 |
| 801.81494 | 0.44 |
| 799.75372 | 0.443 |
| 797.6925 | 0.444 |
| 795.63128 | 0.446 |
| 793.57006 | 0.447 |
| 791.50884 | 0.447 |
| 789.44762 | 0.448 |
| 787.3864 | 0.449 |
| 785.32518 | 0.453 |
| 783.26396 | 0.459 |
| 781.20273 | 0.462 |
| 779.14151 | 0.462 |
| 777.08029 | 0.464 |
| 775.01907 | 0.468 |
| 772.95785 | 0.473 |
| 770.89663 | 0.478 |
| 768.83541 | 0.481 |
| 766.77419 | 0.48 |
| 764.71297 | 0.48 |
| 762.65175 | 0.481 |
| 760.59053 | 0.483 |
| 758.5293 | 0.483 |
| 756.46808 | 0.485 |
| 754.40686 | 0.488 |
| 752.34564 | 0.493 |
| 750.28442 | 0.499 |
| 748.2232 | 0.506 |
| 746.16198 | 0.513 |
| 744.10076 | 0.521 |
| 742.03954 | 0.533 |
| 739.97832 | 0.546 |
| 737.9171 | 0.563 |
| 735.85587 | 0.585 |
| 733.79465 | 0.613 |
| 731.73343 | 0.646 |
| 729.67221 | 0.682 |
| 727.61099 | 0.717 |
| 725.54977 | 0.745 |
| 723.48855 | 0.759 |
| 721.42733 | 0.754 |
| 719.36611 | 0.728 |
| 717.30489 | 0.693 |
| 715.24366 | 0.659 |
| 713.18244 | 0.63 |
| 711.12122 | 0.605 |
| 709.06 | 0.587 |
| 706.99878 | 0.573 |
| 704.93756 | 0.563 |
| 702.87634 | 0.556 |
| 700.81512 | 0.552 |
| 698.7539 | 0.545 |
| 696.69268 | 0.538 |
| 694.63146 | 0.533 |
| 692.57023 | 0.53 |
| 690.50901 | 0.529 |
| 688.44779 | 0.529 |
| 686.38657 | 0.526 |
| 684.32535 | 0.525 |
| 682.26413 | 0.526 |
| 680.20291 | 0.525 |
| 678.14169 | 0.523 |
| 676.08047 | 0.523 |
| 674.01925 | 0.527 |
| 671.95803 | 0.532 |
| 669.8968 | 0.536 |
| 667.83558 | 0.54 |
| 665.77436 | 0.544 |
| 663.71314 | 0.546 |
| 661.65192 | 0.547 |
| 659.5907 | 0.548 |
| 657.52948 | 0.548 |
| 655.46826 | 0.547 |
| 653.40704 | 0.549 |
| 651.34582 | 0.554 |
| 649.28459 | 0.558 |
| 647.22337 | 0.561 |
| 645.16215 | 0.565 |
| 643.10093 | 0.569 |
| 641.03971 | 0.572 |
| 638.97849 | 0.574 |
| 636.91727 | 0.575 |
| 634.85605 | 0.578 |
| 632.79483 | 0.58 |
| 630.73361 | 0.583 |
| 628.67239 | 0.586 |
| 626.61116 | 0.587 |
| 624.54994 | 0.589 |
| 622.48872 | 0.592 |
| 620.4275 | 0.595 |
| 618.36628 | 0.599 |
| 616.30506 | 0.605 |
| 614.24384 | 0.611 |
| 612.18262 | 0.615 |
| 610.1214 | 0.618 |
| 608.06018 | 0.622 |
| 605.99896 | 0.626 |
| 603.93773 | 0.63 |
| 601.87651 | 0.631 |
| 599.81529 | 0.633 |
| 597.75407 | 0.637 |
| 595.69285 | 0.641 |
| 593.63163 | 0.644 |
| 591.57041 | 0.648 |
| 589.50919 | 0.651 |
| 587.44797 | 0.656 |
| 585.38675 | 0.663 |
| 583.32552 | 0.667 |
| 581.2643 | 0.667 |
| 579.20308 | 0.667 |
| 577.14186 | 0.666 |
| 575.08064 | 0.662 |
| 573.01942 | 0.659 |
| 570.9582 | 0.66 |
| 568.89698 | 0.66 |
| 566.83576 | 0.655 |
| 564.77454 | 0.652 |
| 562.71332 | 0.65 |
| 560.65209 | 0.65 |
| 558.59087 | 0.652 |
| 556.52965 | 0.657 |
| 554.46843 | 0.66 |
| 552.40721 | 0.66 |
| 550.34599 | 0.659 |
| 548.28477 | 0.658 |
| 546.22355 | 0.658 |
| 544.16233 | 0.662 |
| 542.10111 | 0.665 |
| 540.03989 | 0.667 |
| 537.97866 | 0.671 |
| 535.91744 | 0.675 |
| 533.85622 | 0.676 |
| 531.795 | 0.673 |
| 529.73378 | 0.67 |
| 527.67256 | 0.67 |
| 525.61134 | 0.674 |
| 523.55012 | 0.674 |
| 521.4889 | 0.672 |
| 519.42768 | 0.672 |
| 517.36645 | 0.671 |
| 515.30523 | 0.67 |
| 513.24401 | 0.67 |
| 511.18279 | 0.675 |
| 509.12157 | 0.68 |
| 507.06035 | 0.681 |
| 504.99913 | 0.679 |
| 502.93791 | 0.678 |
| 500.87669 | 0.677 |
| 498.81547 | 0.683 |
| 496.75425 | 0.69 |
| 494.69302 | 0.692 |
| 492.6318 | 0.695 |
| 490.57058 | 0.703 |
| 488.50936 | 0.707 |
| 486.44814 | 0.713 |
| 484.38692 | 0.721 |
| 482.3257 | 0.724 |
| 480.26448 | 0.722 |
| 478.20326 | 0.721 |
| 476.14204 | 0.728 |
| 474.08082 | 0.744 |
| 472.01959 | 0.762 |
| 469.95837 | 0.772 |
| 467.89715 | 0.777 |
| 465.83593 | 0.783 |
| 463.77471 | 0.788 |
| 461.71349 | 0.789 |
| 459.65227 | 0.782 |
| 457.59105 | 0.774 |
| 455.52983 | 0.771 |
| 453.46861 | 0.771 |
| 451.40738 | 0.766 |
| 449.34616 | 0.753 |
| 447.28494 | 0.745 |
| 445.22372 | 0.747 |
| 443.1625 | 0.75 |
| 441.10128 | 0.755 |
| 439.04006 | 0.764 |
| 436.97884 | 0.763 |
| 434.91762 | 0.757 |
| 432.8564 | 0.756 |
| 430.79518 | 0.76 |
| 428.73395 | 0.761 |
| 426.67273 | 0.764 |
| 424.61151 | 0.767 |
| 422.55029 | 0.765 |
| 420.48907 | 0.762 |
| 418.42785 | 0.754 |
| 416.36663 | 0.745 |
| 414.30541 | 0.746 |
| 412.24419 | 0.743 |
| 410.18297 | 0.734 |
| 408.12175 | 0.733 |
| 406.06052 | 0.734 |
| 403.9993 | 0.73 |
| 401.93808 | 0.724 |
| 399.87686 | 0.728 |